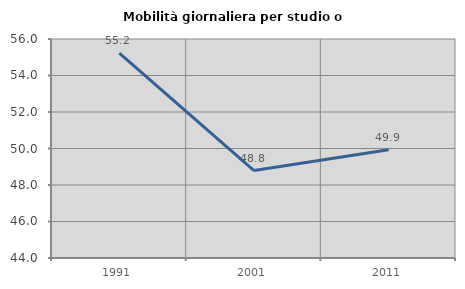
| Category | Mobilità giornaliera per studio o lavoro |
|---|---|
| 1991.0 | 55.225 |
| 2001.0 | 48.792 |
| 2011.0 | 49.935 |